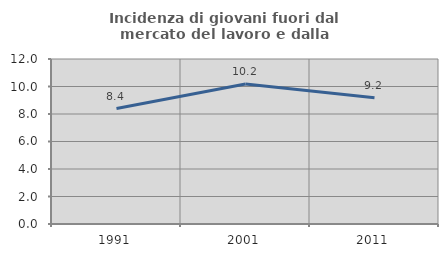
| Category | Incidenza di giovani fuori dal mercato del lavoro e dalla formazione  |
|---|---|
| 1991.0 | 8.396 |
| 2001.0 | 10.185 |
| 2011.0 | 9.184 |